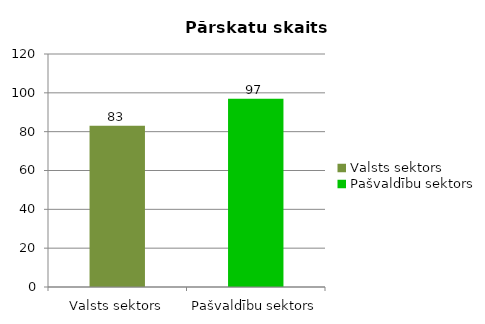
| Category |  Pārskatu skaits |
|---|---|
| Valsts sektors | 83 |
| Pašvaldību sektors | 97 |